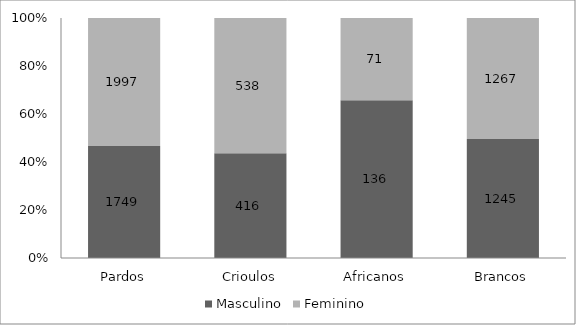
| Category | Masculino | Feminino |
|---|---|---|
| Pardos | 1749 | 1997 |
| Crioulos | 416 | 538 |
| Africanos | 136 | 71 |
| Brancos | 1245 | 1267 |